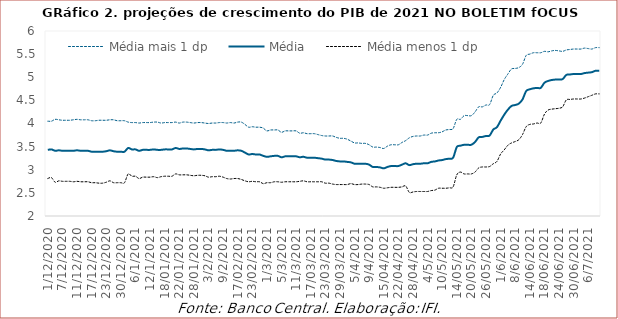
| Category | Média mais 1 dp | Média | Média menos 1 dp |
|---|---|---|---|
| 1/12/2020 | 4.05 | 3.43 | 2.81 |
| 2/12/2020 | 4.05 | 3.44 | 2.83 |
| 3/12/2020 | 4.09 | 3.41 | 2.73 |
| 4/12/2020 | 4.08 | 3.42 | 2.76 |
| 7/12/2020 | 4.07 | 3.41 | 2.75 |
| 8/12/2020 | 4.07 | 3.41 | 2.75 |
| 9/12/2020 | 4.07 | 3.41 | 2.75 |
| 10/12/2020 | 4.08 | 3.41 | 2.74 |
| 11/12/2020 | 4.09 | 3.42 | 2.75 |
| 14/12/2020 | 4.08 | 3.41 | 2.74 |
| 15/12/2020 | 4.08 | 3.41 | 2.74 |
| 16/12/2020 | 4.08 | 3.41 | 2.74 |
| 17/12/2020 | 4.06 | 3.39 | 2.72 |
| 18/12/2020 | 4.06 | 3.39 | 2.72 |
| 21/12/2020 | 4.07 | 3.39 | 2.71 |
| 22/12/2020 | 4.07 | 3.39 | 2.71 |
| 23/12/2020 | 4.07 | 3.4 | 2.73 |
| 24/12/2020 | 4.08 | 3.42 | 2.76 |
| 28/12/2020 | 4.08 | 3.4 | 2.72 |
| 29/12/2020 | 4.06 | 3.39 | 2.72 |
| 30/12/2020 | 4.06 | 3.39 | 2.72 |
| 31/12/2020 | 4.06 | 3.39 | 2.72 |
| 4/1/2021 | 4.03 | 3.47 | 2.91 |
| 5/1/2021 | 4.02 | 3.44 | 2.86 |
| 6/1/2021 | 4.02 | 3.44 | 2.86 |
| 7/1/2021 | 4.01 | 3.41 | 2.81 |
| 8/1/2021 | 4.02 | 3.43 | 2.84 |
| 11/1/2021 | 4.02 | 3.43 | 2.84 |
| 12/1/2021 | 4.02 | 3.43 | 2.84 |
| 13/01/2021 | 4.03 | 3.44 | 2.85 |
| 14/01/2021 | 4.03 | 3.43 | 2.83 |
| 15/01/2021 | 4.01 | 3.43 | 2.85 |
| 18/01/2021 | 4.02 | 3.44 | 2.86 |
| 19/01/2021 | 4.02 | 3.44 | 2.86 |
| 20/01/2021 | 4.02 | 3.44 | 2.86 |
| 21/01/2021 | 4.03 | 3.47 | 2.91 |
| 22/01/2021 | 4.01 | 3.45 | 2.89 |
| 25/01/2021 | 4.03 | 3.46 | 2.89 |
| 26/01/2021 | 4.03 | 3.46 | 2.89 |
| 27/01/2021 | 4.02 | 3.45 | 2.88 |
| 28/01/2021 | 4.01 | 3.44 | 2.87 |
| 29/01/2021 | 4.02 | 3.45 | 2.88 |
| 1/2/2021 | 4.02 | 3.45 | 2.88 |
| 2/2/2021 | 4.01 | 3.44 | 2.87 |
| 3/2/2021 | 4 | 3.42 | 2.84 |
| 4/2/2021 | 4.01 | 3.43 | 2.85 |
| 5/2/2021 | 4.01 | 3.43 | 2.85 |
| 8/2/2021 | 4.02 | 3.44 | 2.86 |
| 9/2/2021 | 4.02 | 3.43 | 2.84 |
| 10/2/2021 | 4.01 | 3.41 | 2.81 |
| 11/2/2021 | 4.02 | 3.41 | 2.8 |
| 12/2/2021 | 4.01 | 3.41 | 2.81 |
| 17/02/2021 | 4.03 | 3.42 | 2.81 |
| 18/02/2021 | 4.03 | 3.41 | 2.79 |
| 19/02/2021 | 3.98 | 3.37 | 2.76 |
| 22/02/2021 | 3.92 | 3.33 | 2.74 |
| 23/02/2021 | 3.93 | 3.34 | 2.75 |
| 24/02/2021 | 3.92 | 3.33 | 2.74 |
| 25/02/2021 | 3.92 | 3.33 | 2.74 |
| 26/02/2021 | 3.9 | 3.3 | 2.7 |
| 1/3/2021 | 3.84 | 3.28 | 2.72 |
| 2/3/2021 | 3.86 | 3.29 | 2.72 |
| 3/3/2021 | 3.86 | 3.3 | 2.74 |
| 4/3/2021 | 3.86 | 3.3 | 2.74 |
| 5/3/2021 | 3.81 | 3.27 | 2.73 |
| 8/3/2021 | 3.84 | 3.29 | 2.74 |
| 9/3/2021 | 3.84 | 3.29 | 2.74 |
| 10/3/2021 | 3.84 | 3.29 | 2.74 |
| 11/3/2021 | 3.84 | 3.29 | 2.74 |
| 12/3/2021 | 3.79 | 3.27 | 2.75 |
| 15/03/2021 | 3.8 | 3.28 | 2.76 |
| 16/03/2021 | 3.78 | 3.26 | 2.74 |
| 17/03/2021 | 3.78 | 3.26 | 2.74 |
| 18/03/2021 | 3.78 | 3.26 | 2.74 |
| 19/03/2021 | 3.76 | 3.25 | 2.74 |
| 22/03/2021 | 3.74 | 3.24 | 2.74 |
| 23/03/2021 | 3.73 | 3.22 | 2.71 |
| 24/03/2021 | 3.73 | 3.22 | 2.71 |
| 25/03/2021 | 3.73 | 3.21 | 2.69 |
| 26/03/2021 | 3.7 | 3.19 | 2.68 |
| 29/03/2021 | 3.68 | 3.18 | 2.68 |
| 30/03/2021 | 3.68 | 3.18 | 2.68 |
| 31/03/2021 | 3.66 | 3.17 | 2.68 |
| 1/4/2021 | 3.62 | 3.16 | 2.7 |
| 5/4/2021 | 3.58 | 3.13 | 2.68 |
| 6/4/2021 | 3.58 | 3.13 | 2.68 |
| 7/4/2021 | 3.57 | 3.13 | 2.69 |
| 8/4/2021 | 3.57 | 3.13 | 2.69 |
| 9/4/2021 | 3.54 | 3.11 | 2.68 |
| 12/4/2021 | 3.49 | 3.06 | 2.63 |
| 13/04/2021 | 3.49 | 3.06 | 2.63 |
| 14/04/2021 | 3.48 | 3.05 | 2.62 |
| 15/04/2021 | 3.46 | 3.03 | 2.6 |
| 16/04/2021 | 3.51 | 3.06 | 2.61 |
| 19/04/2021 | 3.54 | 3.08 | 2.62 |
| 20/04/2021 | 3.54 | 3.08 | 2.62 |
| 22/04/2021 | 3.54 | 3.08 | 2.62 |
| 23/04/2021 | 3.59 | 3.11 | 2.63 |
| 26/04/2021 | 3.63 | 3.14 | 2.65 |
| 27/04/2021 | 3.69 | 3.1 | 2.51 |
| 28/04/2021 | 3.72 | 3.12 | 2.52 |
| 29/04/2021 | 3.73 | 3.13 | 2.53 |
| 30/04/2021 | 3.73 | 3.13 | 2.53 |
| 3/5/2021 | 3.75 | 3.14 | 2.53 |
| 4/5/2021 | 3.75 | 3.14 | 2.53 |
| 5/5/2021 | 3.79 | 3.17 | 2.55 |
| 6/5/2021 | 3.8 | 3.18 | 2.56 |
| 7/5/2021 | 3.8 | 3.2 | 2.6 |
| 10/5/2021 | 3.82 | 3.21 | 2.6 |
| 11/5/2021 | 3.86 | 3.23 | 2.6 |
| 12/5/2021 | 3.87 | 3.24 | 2.61 |
| 13/05/2021 | 3.89 | 3.26 | 2.63 |
| 14/05/2021 | 4.09 | 3.49 | 2.89 |
| 17/05/2021 | 4.09 | 3.52 | 2.95 |
| 18/05/2021 | 4.17 | 3.54 | 2.91 |
| 19/05/2021 | 4.17 | 3.54 | 2.91 |
| 20/05/2021 | 4.17 | 3.54 | 2.91 |
| 21/05/2021 | 4.25 | 3.6 | 2.95 |
| 24/05/2021 | 4.36 | 3.7 | 3.04 |
| 25/05/2021 | 4.36 | 3.71 | 3.06 |
| 26/05/2021 | 4.4 | 3.73 | 3.06 |
| 27/05/2021 | 4.41 | 3.74 | 3.07 |
| 28/05/2021 | 4.61 | 3.87 | 3.13 |
| 31/05/2021 | 4.66 | 3.92 | 3.18 |
| 1/6/2021 | 4.78 | 4.06 | 3.34 |
| 2/6/2021 | 4.95 | 4.19 | 3.43 |
| 4/6/2021 | 5.07 | 4.3 | 3.53 |
| 7/6/2021 | 5.18 | 4.38 | 3.58 |
| 8/6/2021 | 5.19 | 4.4 | 3.61 |
| 9/6/2021 | 5.21 | 4.43 | 3.65 |
| 10/6/2021 | 5.28 | 4.52 | 3.76 |
| 11/6/2021 | 5.47 | 4.7 | 3.93 |
| 14/06/2021 | 5.5 | 4.74 | 3.98 |
| 15/06/2021 | 5.53 | 4.76 | 3.99 |
| 16/06/2021 | 5.53 | 4.77 | 4.01 |
| 17/06/2021 | 5.53 | 4.77 | 4.01 |
| 18/06/2021 | 5.56 | 4.88 | 4.2 |
| 21/06/2021 | 5.55 | 4.92 | 4.29 |
| 22/06/2021 | 5.57 | 4.94 | 4.31 |
| 23/06/2021 | 5.58 | 4.95 | 4.32 |
| 24/06/2021 | 5.57 | 4.95 | 4.33 |
| 25/06/2021 | 5.56 | 4.96 | 4.36 |
| 28/06/2021 | 5.59 | 5.05 | 4.51 |
| 29/06/2021 | 5.6 | 5.06 | 4.52 |
| 30/06/2021 | 5.61 | 5.07 | 4.53 |
| 1/7/2021 | 5.61 | 5.07 | 4.53 |
| 2/7/2021 | 5.61 | 5.07 | 4.53 |
| 5/7/2021 | 5.63 | 5.09 | 4.55 |
| 6/7/2021 | 5.62 | 5.1 | 4.58 |
| 7/7/2021 | 5.61 | 5.11 | 4.61 |
| 8/7/2021 | 5.64 | 5.14 | 4.64 |
| 9/7/2021 | 5.64 | 5.14 | 4.64 |